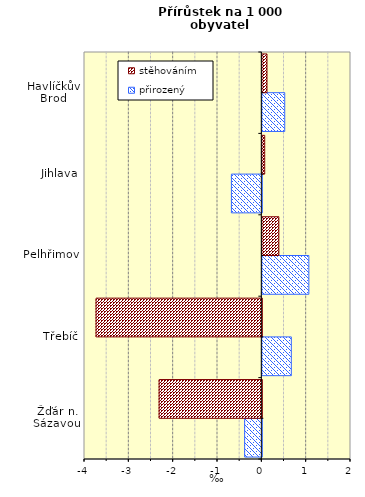
| Category | přirozený | stěhováním |
|---|---|---|
| Žďár n. Sázavou | -0.387 | -2.316 |
| Třebíč | 0.654 | -3.738 |
| Pelhřimov | 1.049 | 0.373 |
| Jihlava | -0.686 | 0.053 |
| Havlíčkův Brod | 0.505 | 0.105 |